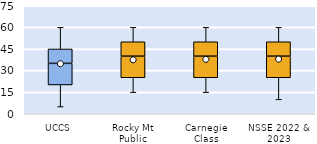
| Category | 25th | 50th | 75th |
|---|---|---|---|
| UCCS | 20 | 15 | 10 |
| Rocky Mt Public | 25 | 15 | 10 |
| Carnegie Class | 25 | 15 | 10 |
| NSSE 2022 & 2023 | 25 | 15 | 10 |